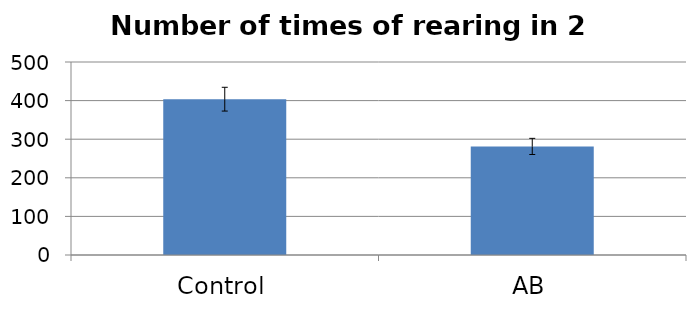
| Category | Average |
|---|---|
| Control | 403.682 |
| AB | 281.278 |